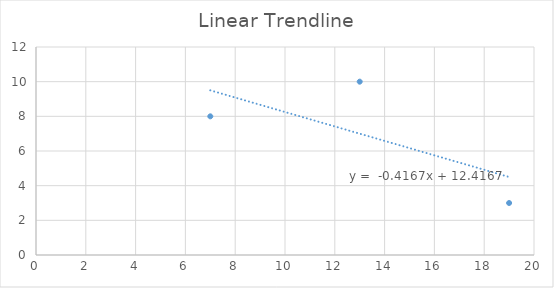
| Category | Series 0 |
|---|---|
| 13.0 | 10 |
| 7.0 | 8 |
| 19.0 | 3 |